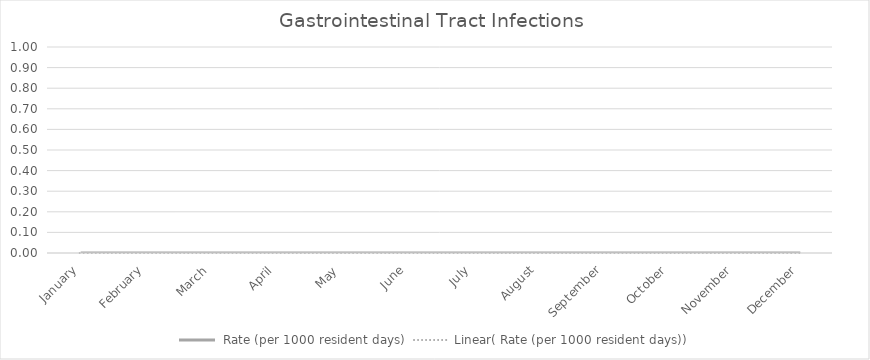
| Category |  Rate (per 1000 resident days) |
|---|---|
| January | 0 |
| February | 0 |
| March | 0 |
| April | 0 |
| May | 0 |
| June | 0 |
| July | 0 |
| August | 0 |
| September | 0 |
| October | 0 |
| November | 0 |
| December | 0 |